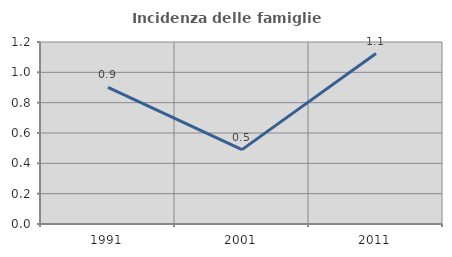
| Category | Incidenza delle famiglie numerose |
|---|---|
| 1991.0 | 0.901 |
| 2001.0 | 0.49 |
| 2011.0 | 1.124 |